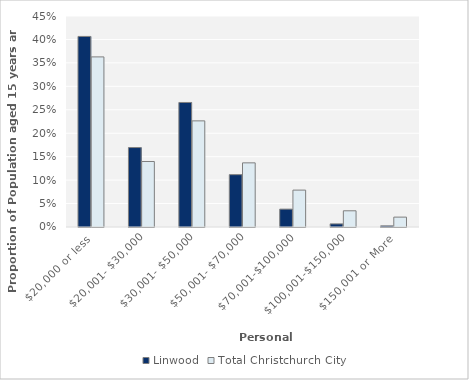
| Category | Linwood | Total Christchurch City |
|---|---|---|
| $20,000 or less | 0.406 | 0.363 |
| $20,001- $30,000 | 0.169 | 0.14 |
| $30,001- $50,000 | 0.266 | 0.226 |
| $50,001- $70,000 | 0.112 | 0.137 |
| $70,001-$100,000 | 0.038 | 0.079 |
| $100,001-$150,000 | 0.007 | 0.035 |
| $150,001 or More | 0.002 | 0.021 |